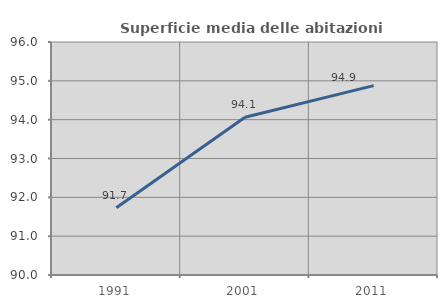
| Category | Superficie media delle abitazioni occupate |
|---|---|
| 1991.0 | 91.731 |
| 2001.0 | 94.061 |
| 2011.0 | 94.877 |